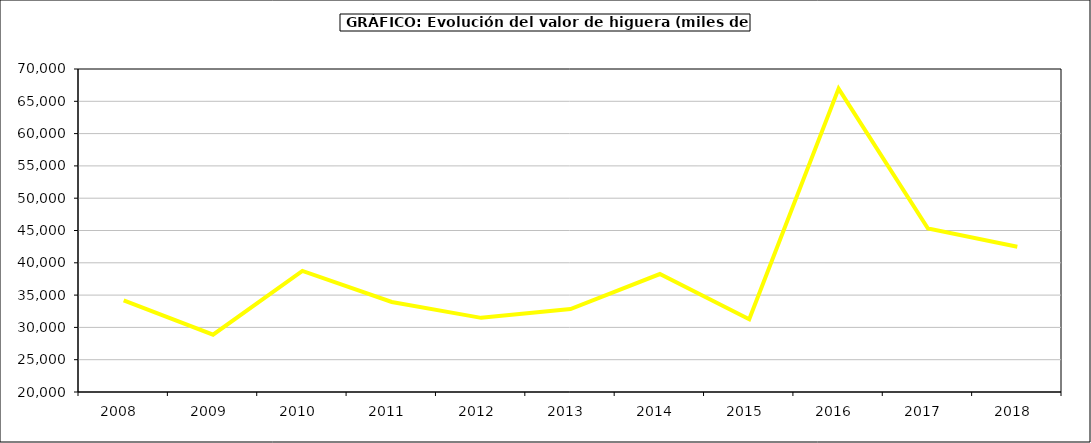
| Category | valor higuera |
|---|---|
| 2008.0 | 34191.335 |
| 2009.0 | 28875.392 |
| 2010.0 | 38741.248 |
| 2011.0 | 33937.485 |
| 2012.0 | 31478.992 |
| 2013.0 | 32844.373 |
| 2014.0 | 38257.221 |
| 2015.0 | 31266 |
| 2016.0 | 66968 |
| 2017.0 | 45296.738 |
| 2018.0 | 42473.625 |